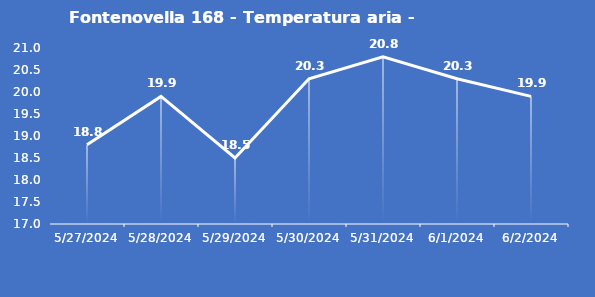
| Category | Fontenovella 168 - Temperatura aria - Grezzo (°C) |
|---|---|
| 5/27/24 | 18.8 |
| 5/28/24 | 19.9 |
| 5/29/24 | 18.5 |
| 5/30/24 | 20.3 |
| 5/31/24 | 20.8 |
| 6/1/24 | 20.3 |
| 6/2/24 | 19.9 |